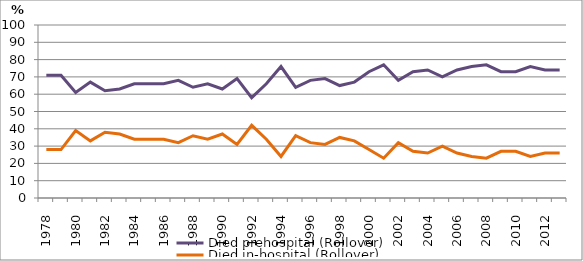
| Category | Died prehospital (Rollover) | Died in-hospital (Rollover) |
|---|---|---|
| 1978.0 | 71 | 28 |
| 1979.0 | 71 | 28 |
| 1980.0 | 61 | 39 |
| 1981.0 | 67 | 33 |
| 1982.0 | 62 | 38 |
| 1983.0 | 63 | 37 |
| 1984.0 | 66 | 34 |
| 1985.0 | 66 | 34 |
| 1986.0 | 66 | 34 |
| 1987.0 | 68 | 32 |
| 1988.0 | 64 | 36 |
| 1989.0 | 66 | 34 |
| 1990.0 | 63 | 37 |
| 1991.0 | 69 | 31 |
| 1992.0 | 58 | 42 |
| 1993.0 | 66 | 34 |
| 1994.0 | 76 | 24 |
| 1995.0 | 64 | 36 |
| 1996.0 | 68 | 32 |
| 1997.0 | 69 | 31 |
| 1998.0 | 65 | 35 |
| 1999.0 | 67 | 33 |
| 2000.0 | 73 | 28 |
| 2001.0 | 77 | 23 |
| 2002.0 | 68 | 32 |
| 2003.0 | 73 | 27 |
| 2004.0 | 74 | 26 |
| 2005.0 | 70 | 30 |
| 2006.0 | 74 | 26 |
| 2007.0 | 76 | 24 |
| 2008.0 | 77 | 23 |
| 2009.0 | 73 | 27 |
| 2010.0 | 73 | 27 |
| 2011.0 | 76 | 24 |
| 2012.0 | 74 | 26 |
| 2013.0 | 74 | 26 |